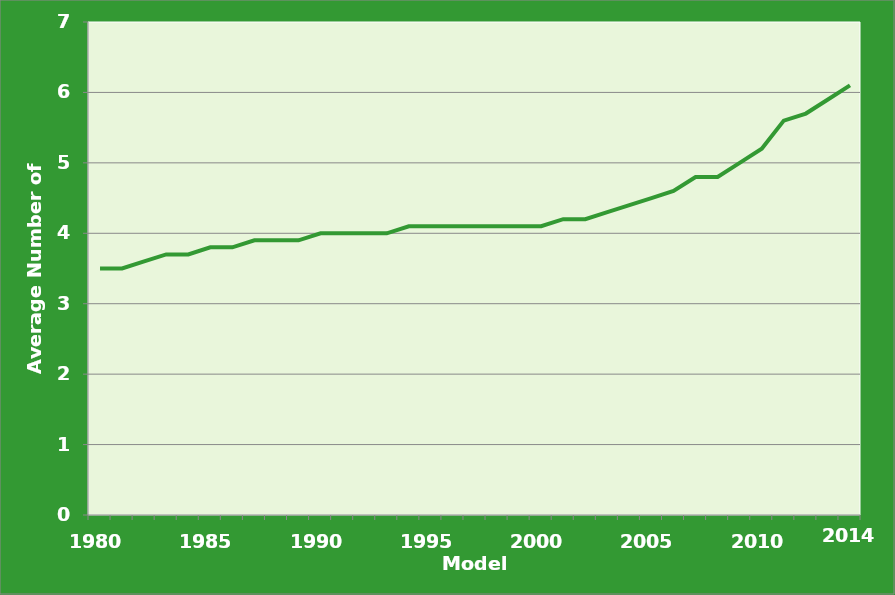
| Category | Series 0 |
|---|---|
| 1980.0 | 3.5 |
| 1981.0 | 3.5 |
| 1982.0 | 3.6 |
| 1983.0 | 3.7 |
| 1984.0 | 3.7 |
| 1985.0 | 3.8 |
| 1986.0 | 3.8 |
| 1987.0 | 3.9 |
| 1988.0 | 3.9 |
| 1989.0 | 3.9 |
| 1990.0 | 4 |
| 1991.0 | 4 |
| 1992.0 | 4 |
| 1993.0 | 4 |
| 1994.0 | 4.1 |
| 1995.0 | 4.1 |
| 1996.0 | 4.1 |
| 1997.0 | 4.1 |
| 1998.0 | 4.1 |
| 1999.0 | 4.1 |
| 2000.0 | 4.1 |
| 2001.0 | 4.2 |
| 2002.0 | 4.2 |
| 2003.0 | 4.3 |
| 2004.0 | 4.4 |
| 2005.0 | 4.5 |
| 2006.0 | 4.6 |
| 2007.0 | 4.8 |
| 2008.0 | 4.8 |
| 2009.0 | 5 |
| 2010.0 | 5.2 |
| 2011.0 | 5.6 |
| 2012.0 | 5.7 |
| 2013.0 | 5.9 |
| 2014.0 | 6.1 |